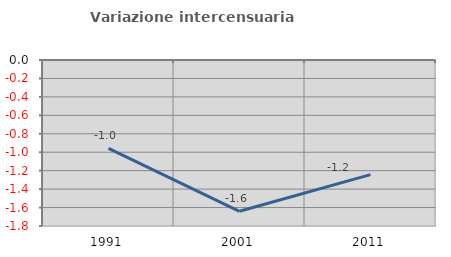
| Category | Variazione intercensuaria annua |
|---|---|
| 1991.0 | -0.959 |
| 2001.0 | -1.64 |
| 2011.0 | -1.243 |